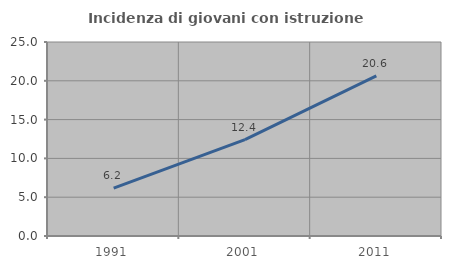
| Category | Incidenza di giovani con istruzione universitaria |
|---|---|
| 1991.0 | 6.166 |
| 2001.0 | 12.426 |
| 2011.0 | 20.628 |